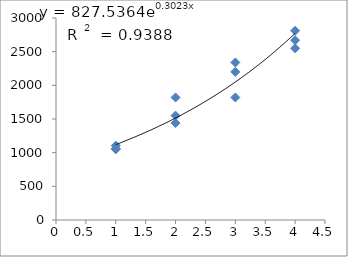
| Category | Series 0 |
|---|---|
| 1.0 | 1050 |
| 1.0 | 1060 |
| 1.0 | 1105 |
| 2.0 | 1820 |
| 2.0 | 1440 |
| 2.0 | 1550 |
| 3.0 | 2200 |
| 3.0 | 1820 |
| 3.0 | 2340 |
| 4.0 | 2670 |
| 4.0 | 2810 |
| 4.0 | 2550 |